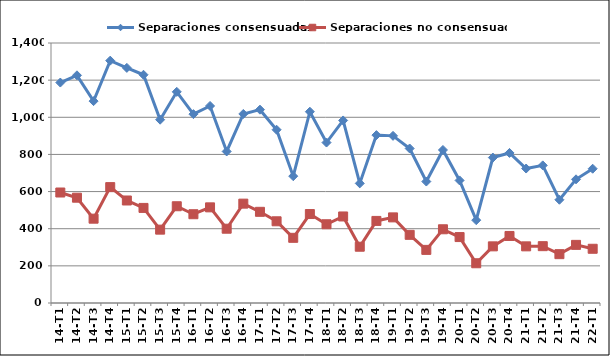
| Category | Separaciones consensuadas | Separaciones no consensuadas |
|---|---|---|
| 14-T1 | 1187 | 595 |
| 14-T2 | 1226 | 567 |
| 14-T3 | 1087 | 454 |
| 14-T4 | 1305 | 624 |
| 15-T1 | 1266 | 552 |
| 15-T2 | 1229 | 512 |
| 15-T3 | 987 | 395 |
| 15-T4 | 1137 | 521 |
| 16-T1 | 1017 | 478 |
| 16-T2 | 1061 | 515 |
| 16-T3 | 816 | 400 |
| 16-T4 | 1018 | 535 |
| 17-T1 | 1041 | 491 |
| 17-T2 | 933 | 440 |
| 17-T3 | 683 | 351 |
| 17-T4 | 1030 | 479 |
| 18-T1 | 864 | 424 |
| 18-T2 | 983 | 466 |
| 18-T3 | 644 | 303 |
| 18-T4 | 904 | 442 |
| 19-T1 | 900 | 461 |
| 19-T2 | 832 | 367 |
| 19-T3 | 654 | 286 |
| 19-T4 | 824 | 397 |
| 20-T1 | 660 | 355 |
| 20-T2 | 446 | 214 |
| 20-T3 | 783 | 305 |
| 20-T4 | 808 | 361 |
| 21-T1 | 724 | 305 |
| 21-T2 | 741 | 306 |
| 21-T3 | 556 | 263 |
| 21-T4 | 666 | 313 |
| 22-T1 | 723 | 292 |